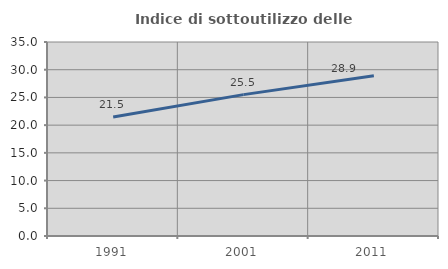
| Category | Indice di sottoutilizzo delle abitazioni  |
|---|---|
| 1991.0 | 21.467 |
| 2001.0 | 25.507 |
| 2011.0 | 28.913 |